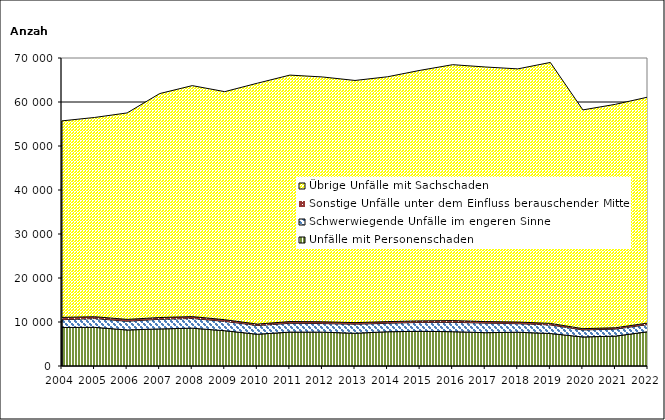
| Category | Unfälle mit Personenschaden | Schwerwiegende Unfälle im engeren Sinne | Sonstige Unfälle unter dem Einfluss berauschender Mittel 1) | Übrige Unfälle mit Sachschaden |
|---|---|---|---|---|
| 2004.0 | 8755 | 1770 | 513 | 44673 |
| 2005.0 | 8788 | 1991 | 422 | 45281 |
| 2006.0 | 8190 | 1977 | 424 | 46926 |
| 2007.0 | 8426 | 2186 | 404 | 50897 |
| 2008.0 | 8594 | 2206 | 432 | 52488 |
| 2009.0 | 8022 | 2115 | 380 | 51835 |
| 2010.0 | 7217 | 1987 | 324 | 54741 |
| 2011.0 | 7704 | 2003 | 394 | 56014 |
| 2012.0 | 7691 | 1958 | 401 | 55640 |
| 2013.0 | 7443 | 2059 | 355 | 55040 |
| 2014.0 | 7787 | 1921 | 380 | 55646 |
| 2015.0 | 7881 | 2030 | 341 | 56944 |
| 2016.0 | 7795 | 2138 | 392 | 58152 |
| 2017.0 | 7572 | 2169 | 356 | 57863 |
| 2018.0 | 7677 | 1941 | 377 | 57533 |
| 2019.0 | 7386 | 1946 | 351 | 59308 |
| 2020.0 | 6600 | 1591 | 293 | 49717 |
| 2021.0 | 6791 | 1595 | 305 | 50783 |
| 2022.0 | 7796 | 1624 | 350 | 51349 |